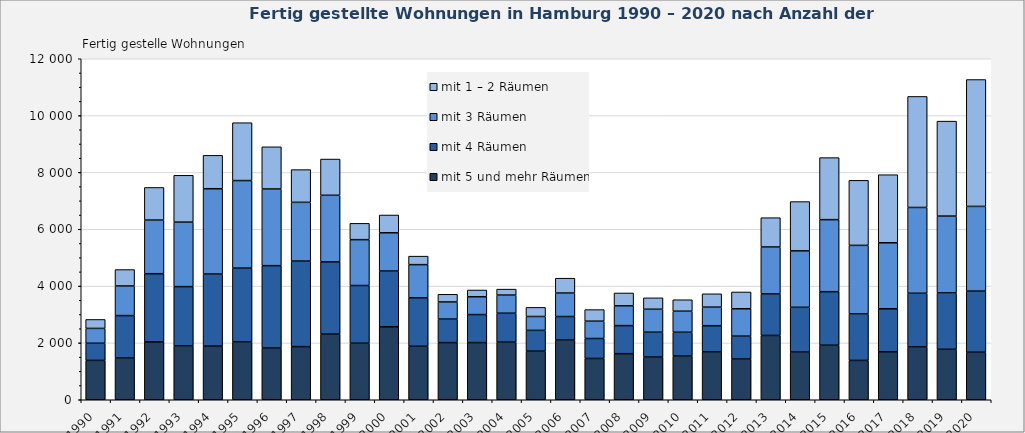
| Category | mit 5 und mehr Räumen | mit 4 Räumen | mit 3 Räumen | mit 1 – 2 Räumen |
|---|---|---|---|---|
| 1990.0 | 1386 | 603 | 522 | 315 |
| 1991.0 | 1469 | 1493 | 1042 | 578 |
| 1992.0 | 2037 | 2399 | 1887 | 1148 |
| 1993.0 | 1893 | 2088 | 2270 | 1648 |
| 1994.0 | 1888 | 2537 | 3001 | 1175 |
| 1995.0 | 2034 | 2599 | 3080 | 2037 |
| 1996.0 | 1820 | 2899 | 2698 | 1485 |
| 1997.0 | 1870 | 3010 | 2067 | 1152 |
| 1998.0 | 2310 | 2544 | 2341 | 1276 |
| 1999.0 | 1990 | 2030 | 1614 | 574 |
| 2000.0 | 2568 | 1962 | 1345 | 627 |
| 2001.0 | 1883 | 1704 | 1168 | 299 |
| 2002.0 | 2011 | 828 | 603 | 269 |
| 2003.0 | 2012 | 986 | 627 | 237 |
| 2004.0 | 2027 | 1019 | 638 | 209 |
| 2005.0 | 1711 | 731 | 488 | 321 |
| 2006.0 | 2103 | 826 | 826 | 523 |
| 2007.0 | 1453 | 702 | 610 | 408 |
| 2008.0 | 1622 | 986 | 698 | 452 |
| 2009.0 | 1503 | 875 | 807 | 402 |
| 2010.0 | 1539 | 837 | 741 | 403 |
| 2011.0 | 1685 | 920 | 655 | 469 |
| 2012.0 | 1433 | 806 | 963 | 591 |
| 2013.0 | 2264 | 1461 | 1651 | 1031 |
| 2014.0 | 1680 | 1574 | 1986 | 1734 |
| 2015.0 | 1920 | 1883 | 2535 | 2183 |
| 2016.0 | 1385 | 1636 | 2412 | 2289 |
| 2017.0 | 1689 | 1512 | 2323 | 2396 |
| 2018.0 | 1858 | 1890 | 3019 | 3907 |
| 2019.0 | 1775 | 1985 | 2703 | 3342 |
| 2020.0 | 1673 | 2151 | 2980 | 4465 |